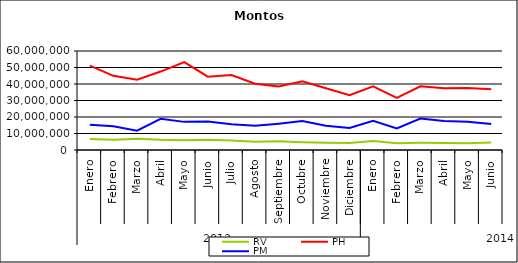
| Category | RV | PH | PM |
|---|---|---|---|
| 0 | 6603412.357 | 51097257.501 | 15291994.497 |
| 1 | 6144371.716 | 44938482.89 | 14418861.164 |
| 2 | 6870539.137 | 42574717.992 | 11735480.075 |
| 3 | 6139858.354 | 47535968.024 | 18924825.739 |
| 4 | 5890476.617 | 53273527.932 | 17047621.863 |
| 5 | 6142686.449 | 44450017.2 | 17254269.094 |
| 6 | 5792277.798 | 45481930.674 | 15546714.502 |
| 7 | 4962192.427 | 40196203.529 | 14644148.591 |
| 8 | 5244267.415 | 38549056.812 | 15946518.356 |
| 9 | 4723321.466 | 41614732.22 | 17536811.707 |
| 10 | 4437368.656 | 37439358.84 | 14761398.421 |
| 11 | 4226608.984 | 33178083.97 | 13384599.022 |
| 12 | 5420667.417 | 38592535.269 | 17738595.757 |
| 13 | 4106438.771 | 31549668.118 | 13082413.394 |
| 14 | 4333641.03 | 38643419.598 | 19107804.717 |
| 15 | 4275572.01 | 37358737.373 | 17555594.298 |
| 16 | 4139390.073 | 37637742.383 | 17146834.395 |
| 17 | 4553837.188 | 36763239.571 | 15771052.834 |